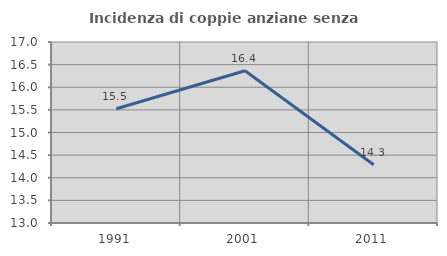
| Category | Incidenza di coppie anziane senza figli  |
|---|---|
| 1991.0 | 15.523 |
| 2001.0 | 16.364 |
| 2011.0 | 14.286 |